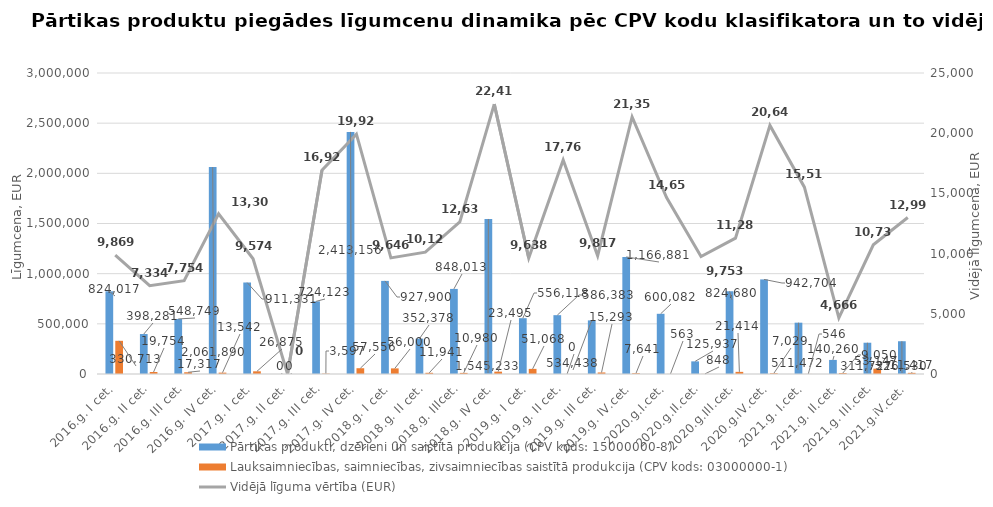
| Category | Pārtikas produkti, dzērieni un saistītā produkcija (CPV kods: 15000000-8) | Lauksaimniecības, saimniecības, zivsaimniecības saistītā produkcija (CPV kods: 03000000-1) |
|---|---|---|
| 2016.g. I cet. | 824017 | 330713 |
| 2016.g. II cet. | 398281 | 19754 |
| 2016.g. III cet. | 548749.01 | 17317 |
| 2016.g. IV cet. | 2061890 | 13542 |
| 2017.g. I cet. | 911330.81 | 26874.91 |
| 2017.g. II cet. | 0 | 0 |
| 2017.g. III cet. | 724123.07 | 3596.6 |
| 2017.g. IV cet. | 2413156 | 57556 |
| 2018.g. I cet. | 927900 | 56000 |
| 2018.g. II cet. | 352378 | 11941 |
| 2018.g. IIIcet. | 848013 | 10980 |
| 2018.g. IV cet. | 1545233 | 23495 |
| 2019.g. I cet. | 556118 | 51068 |
| 2019.g. II cet. | 586383 | 0 |
| 2019.g. III cet. | 534438 | 15293 |
| 2019.g. IV.cet. | 1166881 | 7641 |
| 2020.g.I.cet. | 600082 | 563 |
| 2020.g.II.cet. | 125937 | 848 |
| 2020.g.III.cet. | 824680 | 21414 |
| 2020.g.IV.cet. | 942704 | 7029 |
| 2021.g. I.cet. | 511472 | 546 |
| 2021.g. II.cet. | 140260 | 9050 |
| 2021.g. III.cet. | 311727 | 53147 |
| 2021.g.iV.cet. | 326530 | 11417 |